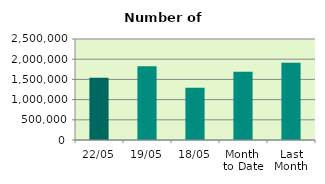
| Category | Series 0 |
|---|---|
| 22/05 | 1543534 |
| 19/05 | 1824380 |
| 18/05 | 1295546 |
| Month 
to Date | 1690348.267 |
| Last
Month | 1909115.889 |